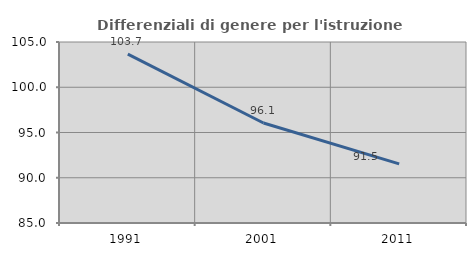
| Category | Differenziali di genere per l'istruzione superiore |
|---|---|
| 1991.0 | 103.651 |
| 2001.0 | 96.053 |
| 2011.0 | 91.533 |